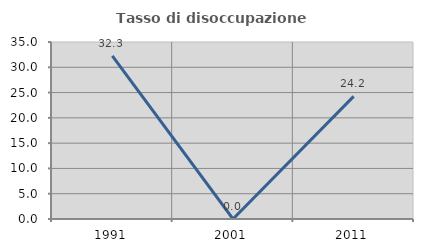
| Category | Tasso di disoccupazione giovanile  |
|---|---|
| 1991.0 | 32.258 |
| 2001.0 | 0 |
| 2011.0 | 24.242 |